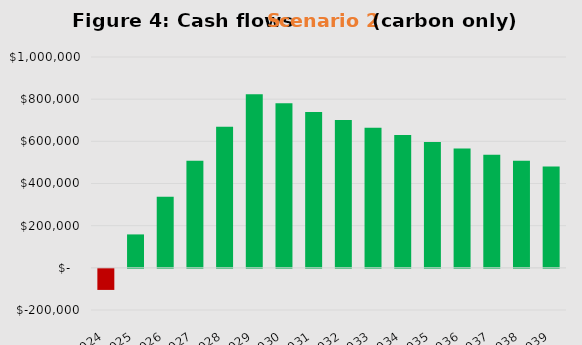
| Category | Series 0 |
|---|---|
| 2024.0 | -100000 |
| 2025.0 | 158500 |
| 2026.0 | 337575 |
| 2027.0 | 507696.25 |
| 2028.0 | 669311.438 |
| 2029.0 | 822845.866 |
| 2030.0 | 780203.572 |
| 2031.0 | 739693.394 |
| 2032.0 | 701208.724 |
| 2033.0 | 664648.288 |
| 2034.0 | 629915.873 |
| 2035.0 | 596920.08 |
| 2036.0 | 565574.076 |
| 2037.0 | 535795.372 |
| 2038.0 | 507505.603 |
| 2039.0 | 480630.323 |